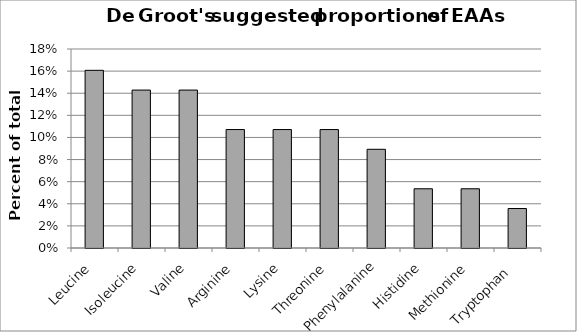
| Category | Series 0 |
|---|---|
| Leucine | 0.161 |
| Isoleucine | 0.143 |
| Valine | 0.143 |
| Arginine | 0.107 |
| Lysine | 0.107 |
| Threonine | 0.107 |
| Phenylalanine | 0.089 |
| Histidine | 0.054 |
| Methionine | 0.054 |
| Tryptophan  | 0.036 |